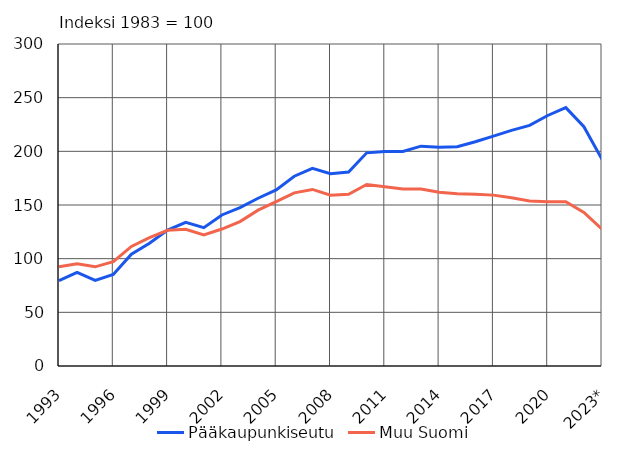
| Category | Pääkaupunkiseutu | Muu Suomi |
|---|---|---|
| 1993 | 79.6 | 92.5 |
| 1994 | 87.2 | 95.2 |
| 1995 | 79.8 | 92.4 |
| 1996 | 85.2 | 97.2 |
| 1997 | 104.2 | 111.4 |
| 1998 | 114.4 | 119.6 |
| 1999 | 126.6 | 126.4 |
| 2000 | 133.8 | 127.3 |
| 2001 | 128.9 | 122.2 |
| 2002 | 140.7 | 127.6 |
| 2003 | 147.6 | 134.5 |
| 2004 | 156.3 | 145.2 |
| 2005 | 164.1 | 153.1 |
| 2006 | 176.8 | 161.3 |
| 2007 | 184.2 | 164.5 |
| 2008 | 179.1 | 159.1 |
| 2009 | 180.8 | 160 |
| 2010 | 198.6 | 169.1 |
| 2011 | 199.8 | 166.9 |
| 2012 | 199.9 | 165 |
| 2013 | 204.8 | 165 |
| 2014 | 203.7 | 161.9 |
| 2015 | 204.3 | 160.4 |
| 2016 | 208.9 | 160.1 |
| 2017 | 214.2 | 159.2 |
| 2018 | 219.5 | 156.8 |
| 2019 | 224.2 | 153.8 |
| 2020 | 233.4 | 153.1 |
| 2021 | 240.7 | 153.1 |
| 2022 | 222.9 | 143 |
| 2023* | 192.5 | 127.4 |